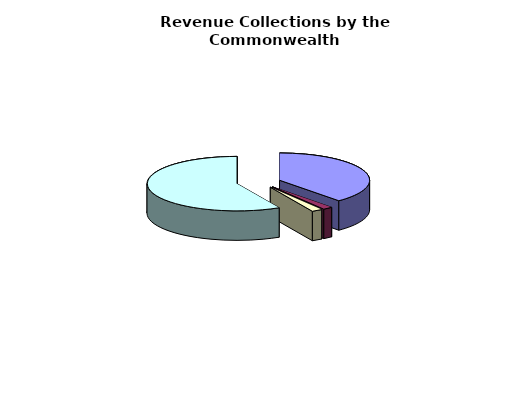
| Category | Series 0 |
|---|---|
| General Fund | 15733790000 |
| Non-General Fund | 718404000 |
| General Fund | 785853000 |
| Non-General Fund | 23556988000 |